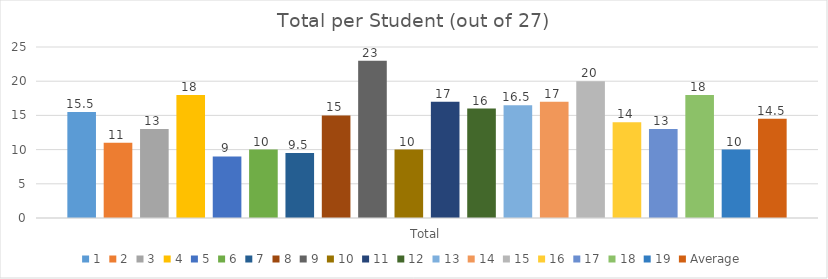
| Category | 1 | 2 | 3 | 4 | 5 | 6 | 7 | 8 | 9 | 10 | 11 | 12 | 13 | 14 | 15 | 16 | 17 | 18 | 19 | Average |
|---|---|---|---|---|---|---|---|---|---|---|---|---|---|---|---|---|---|---|---|---|
| Total | 15.5 | 11 | 13 | 18 | 9 | 10 | 9.5 | 15 | 23 | 10 | 17 | 16 | 16.5 | 17 | 20 | 14 | 13 | 18 | 10 | 14.5 |